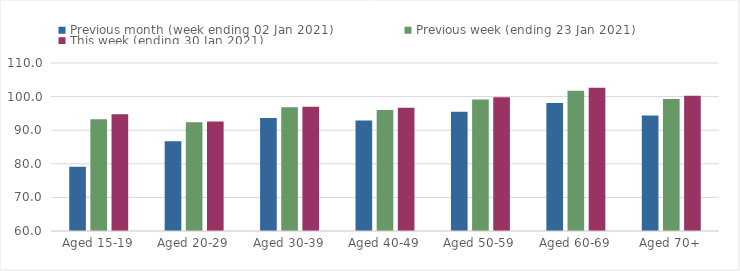
| Category | Previous month (week ending 02 Jan 2021) | Previous week (ending 23 Jan 2021) | This week (ending 30 Jan 2021) |
|---|---|---|---|
| Aged 15-19 | 79.11 | 93.28 | 94.74 |
| Aged 20-29 | 86.73 | 92.4 | 92.58 |
| Aged 30-39 | 93.62 | 96.8 | 97 |
| Aged 40-49 | 92.92 | 95.99 | 96.66 |
| Aged 50-59 | 95.49 | 99.17 | 99.81 |
| Aged 60-69 | 98.11 | 101.74 | 102.6 |
| Aged 70+ | 94.41 | 99.32 | 100.29 |